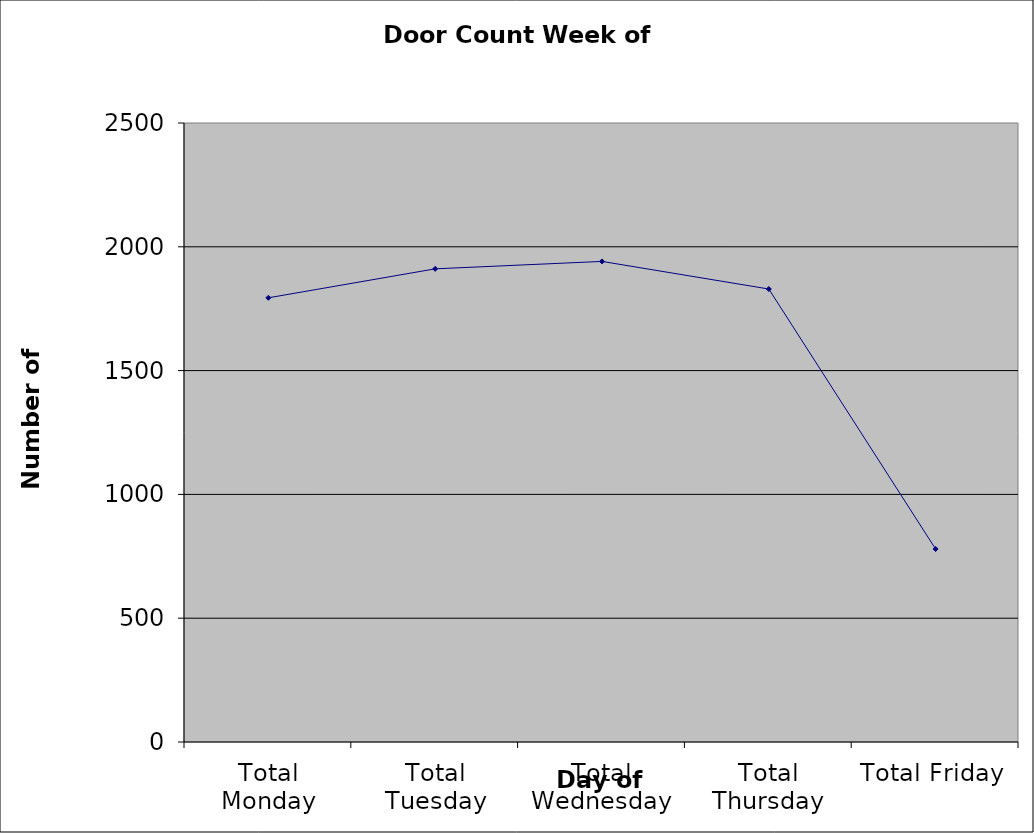
| Category | Series 0 |
|---|---|
| Total Monday | 1794 |
| Total Tuesday | 1911 |
| Total Wednesday | 1941 |
| Total Thursday | 1829.5 |
| Total Friday | 779.5 |